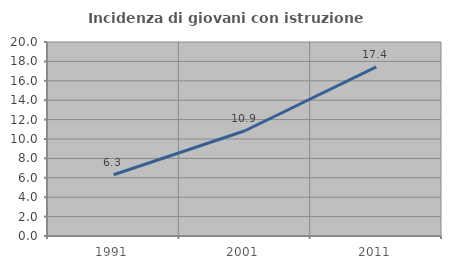
| Category | Incidenza di giovani con istruzione universitaria |
|---|---|
| 1991.0 | 6.316 |
| 2001.0 | 10.853 |
| 2011.0 | 17.431 |